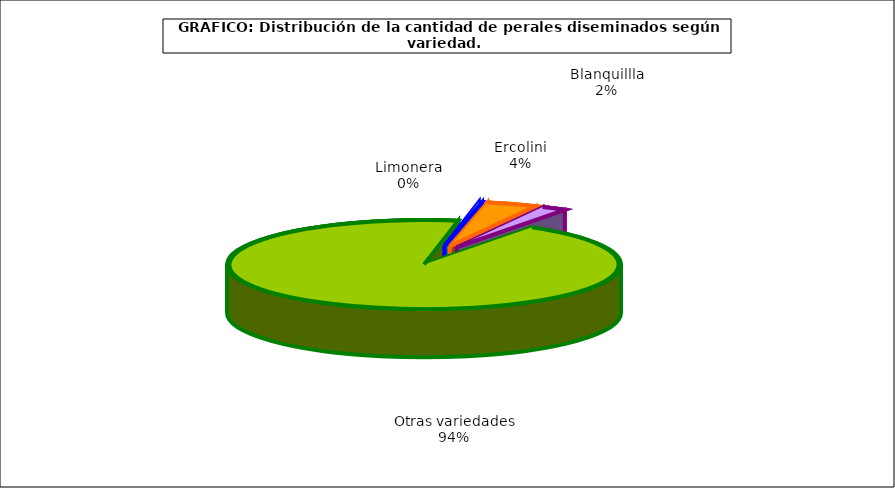
| Category | arboles |
|---|---|
| 0 | 1.37 |
| 1 | 20.507 |
| 2 | 10.212 |
| 3 | 465.272 |